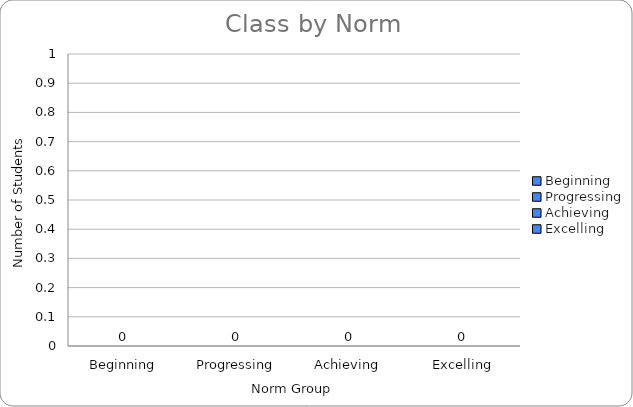
| Category | Series 0 |
|---|---|
| Beginning | 0 |
| Progressing | 0 |
| Achieving  | 0 |
| Excelling | 0 |